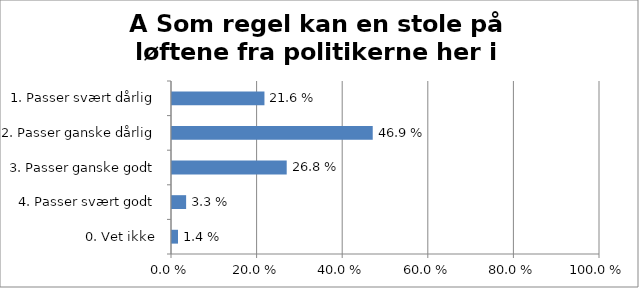
| Category | A Som regel kan en stole på løftene fra politikerne her i kommunen |
|---|---|
| 1. Passer svært dårlig | 0.216 |
| 2. Passer ganske dårlig | 0.469 |
| 3. Passer ganske godt | 0.268 |
| 4. Passer svært godt | 0.033 |
| 0. Vet ikke | 0.014 |